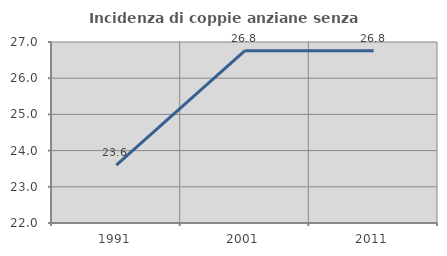
| Category | Incidenza di coppie anziane senza figli  |
|---|---|
| 1991.0 | 23.596 |
| 2001.0 | 26.761 |
| 2011.0 | 26.761 |